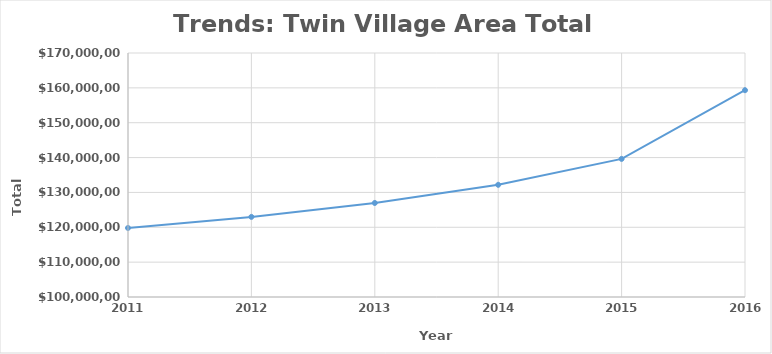
| Category | Total Wages |
|---|---|
| 2016.0 | 159328686 |
| 2015.0 | 139622056 |
| 2014.0 | 132186970 |
| 2013.0 | 126977085 |
| 2012.0 | 122984785 |
| 2011.0 | 119808907 |